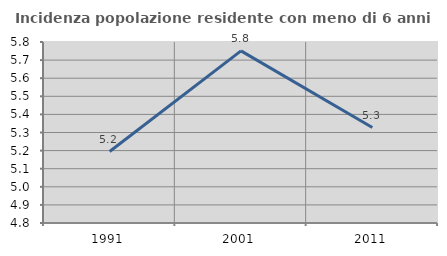
| Category | Incidenza popolazione residente con meno di 6 anni |
|---|---|
| 1991.0 | 5.195 |
| 2001.0 | 5.751 |
| 2011.0 | 5.327 |